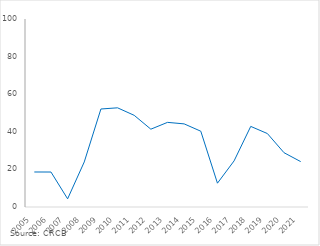
| Category | Series 0 |
|---|---|
| 2005.0 | 18.624 |
| 2006.0 | 18.603 |
| 2007.0 | 4.342 |
| 2008.0 | 23.961 |
| 2009.0 | 52.132 |
| 2010.0 | 52.755 |
| 2011.0 | 48.76 |
| 2012.0 | 41.397 |
| 2013.0 | 45.021 |
| 2014.0 | 44.212 |
| 2015.0 | 40.315 |
| 2016.0 | 12.671 |
| 2017.0 | 24.533 |
| 2018.0 | 42.871 |
| 2019.0 | 39.069 |
| 2020.0 | 28.879 |
| 2021.0 | 24.147 |